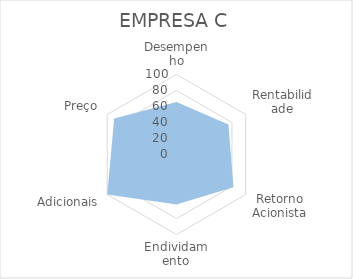
| Category | Series 0 |
|---|---|
| Desempenho | 65.71 |
| Rentabilidade | 75 |
| Retorno Acionista | 82.14 |
| Endividamento | 62.5 |
| Adicionais | 100 |
| Preço | 89.93 |